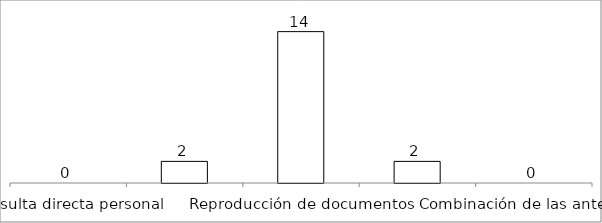
| Category | Series 0 |
|---|---|
| Consulta directa personal | 0 |
| Consulta directa electrónica | 2 |
| Reproducción de documentos | 14 |
| Elaboración de informes | 2 |
| Combinación de las anteriores | 0 |